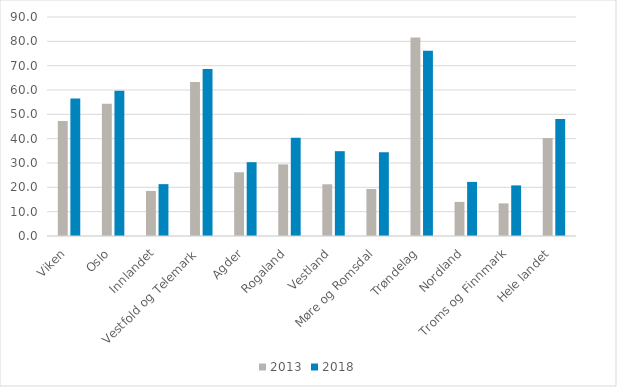
| Category | 2013 | 2018 |
|---|---|---|
| Viken | 47.209 | 56.502 |
| Oslo | 54.347 | 59.663 |
| Innlandet | 18.517 | 21.313 |
| Vestfold og Telemark | 63.301 | 68.593 |
| Agder | 26.184 | 30.33 |
| Rogaland | 29.436 | 40.351 |
| Vestland | 21.255 | 34.859 |
| Møre og Romsdal | 19.315 | 34.419 |
| Trøndelag | 81.569 | 76.119 |
| Nordland | 14.008 | 22.233 |
| Troms og Finnmark | 13.404 | 20.799 |
| Hele landet | 40.285 | 48.119 |